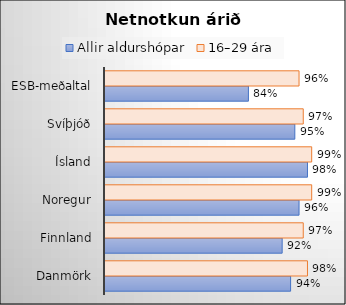
| Category | Allir aldurshópar | 16–29 ára |
|---|---|---|
| Danmörk | 0.94 | 0.98 |
| Finnland | 0.92 | 0.97 |
| Noregur | 0.96 | 0.99 |
| Ísland | 0.98 | 0.99 |
| Svíþjóð | 0.95 | 0.97 |
| ESB-meðaltal | 0.84 | 0.96 |